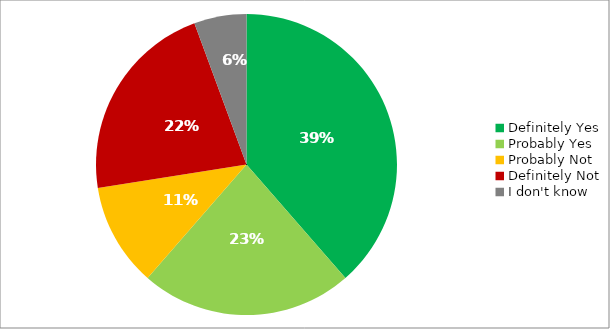
| Category | Responses |
|---|---|
| Definitely Yes | 0.386 |
| Probably Yes | 0.228 |
| Probably Not | 0.111 |
| Definitely Not | 0.219 |
| I don't know | 0.056 |